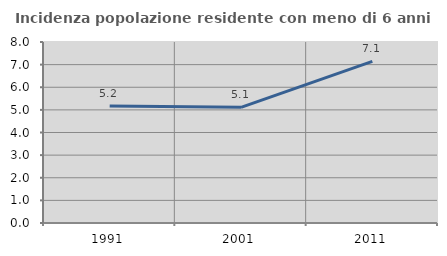
| Category | Incidenza popolazione residente con meno di 6 anni |
|---|---|
| 1991.0 | 5.172 |
| 2001.0 | 5.111 |
| 2011.0 | 7.146 |